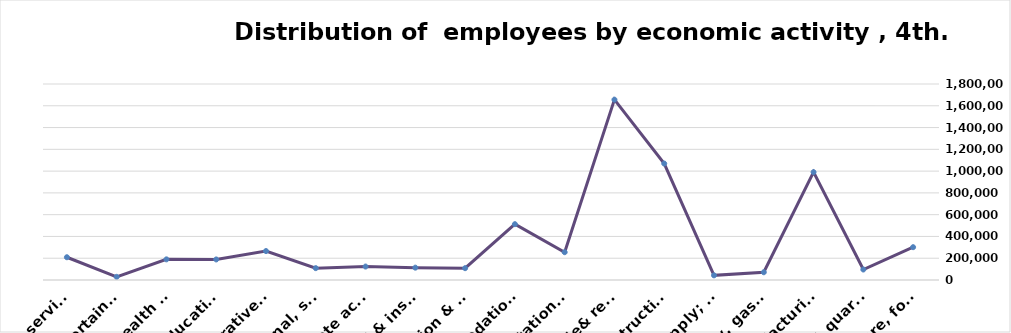
| Category | Series 0 |
|---|---|
| Agriculture, forestry & fishing | 301426 |
| Mining & quarrying | 96285 |
| Manufacturing | 990502 |
| Electricity, gas, steam & air conditioning supply | 71120 |
| Water supply; sewerage, waste remediation  | 42683 |
| Construction | 1069424 |
| Wholesale& retail trade; repair of motor vehicles | 1656284 |
| Transportation& storage | 255298 |
| Accommodation & food service activities | 512777 |
| Information & communication | 108594 |
| Financial & insurance | 113384 |
| Real estate activities | 123591 |
| Professional, scientific & technical activities | 108823 |
| Administrative and support service activities | 265651 |
| Education | 188733 |
| Human health and &l work activities | 189599 |
| Arts, entertainment & recreation | 29096 |
| Other service | 209043 |